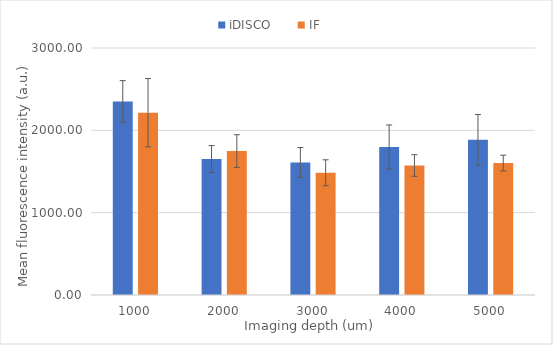
| Category | iDISCO | IF |
|---|---|---|
| 1000.0 | 2351.677 | 2214.07 |
| 2000.0 | 1651.637 | 1748.353 |
| 3000.0 | 1610.34 | 1484.097 |
| 4000.0 | 1797.067 | 1573.127 |
| 5000.0 | 1884.123 | 1602.45 |